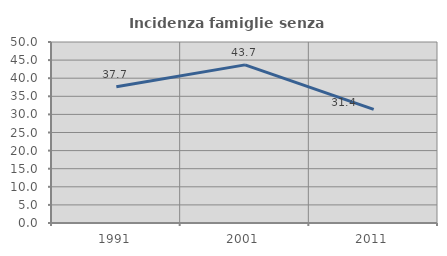
| Category | Incidenza famiglie senza nuclei |
|---|---|
| 1991.0 | 37.662 |
| 2001.0 | 43.678 |
| 2011.0 | 31.395 |